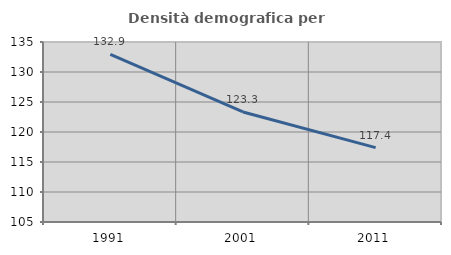
| Category | Densità demografica |
|---|---|
| 1991.0 | 132.926 |
| 2001.0 | 123.341 |
| 2011.0 | 117.403 |